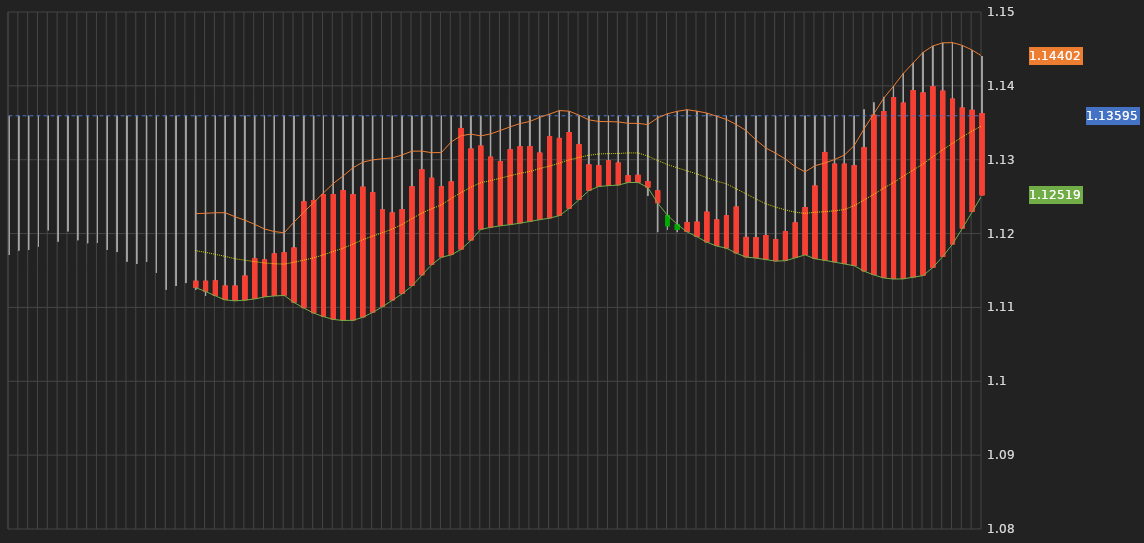
| Category | Series 0 | Series 1 | Series 2 | Series 3 |
|---|---|---|---|---|
| 23/05/2019 18:00:00 | 1.118 | 1.118 | 1.117 | 1.118 |
| 24/05/2019 00:00:00 | 1.118 | 1.118 | 1.118 | 1.118 |
| 24/05/2019 06:00:00 | 1.118 | 1.121 | 1.118 | 1.118 |
| 24/05/2019 12:00:00 | 1.118 | 1.121 | 1.118 | 1.121 |
| 24/05/2019 18:00:00 | 1.121 | 1.121 | 1.12 | 1.12 |
| 26/05/2019 18:00:00 | 1.119 | 1.121 | 1.119 | 1.121 |
| 27/05/2019 00:00:00 | 1.121 | 1.122 | 1.12 | 1.121 |
| 27/05/2019 06:00:00 | 1.121 | 1.121 | 1.119 | 1.12 |
| 27/05/2019 12:00:00 | 1.12 | 1.12 | 1.119 | 1.119 |
| 27/05/2019 18:00:00 | 1.119 | 1.119 | 1.119 | 1.119 |
| 28/05/2019 00:00:00 | 1.119 | 1.12 | 1.118 | 1.119 |
| 28/05/2019 06:00:00 | 1.119 | 1.12 | 1.118 | 1.119 |
| 28/05/2019 12:00:00 | 1.119 | 1.119 | 1.116 | 1.117 |
| 28/05/2019 18:00:00 | 1.117 | 1.117 | 1.116 | 1.117 |
| 29/05/2019 00:00:00 | 1.117 | 1.117 | 1.116 | 1.117 |
| 29/05/2019 06:00:00 | 1.117 | 1.117 | 1.115 | 1.115 |
| 29/05/2019 12:00:00 | 1.115 | 1.116 | 1.112 | 1.114 |
| 29/05/2019 18:00:00 | 1.114 | 1.114 | 1.113 | 1.114 |
| 30/05/2019 00:00:00 | 1.114 | 1.114 | 1.113 | 1.114 |
| 30/05/2019 06:00:00 | 1.114 | 1.114 | 1.112 | 1.114 |
| 30/05/2019 12:00:00 | 1.114 | 1.114 | 1.112 | 1.114 |
| 30/05/2019 18:00:00 | 1.114 | 1.114 | 1.113 | 1.113 |
| 31/05/2019 00:00:00 | 1.113 | 1.114 | 1.112 | 1.113 |
| 31/05/2019 06:00:00 | 1.113 | 1.116 | 1.113 | 1.114 |
| 31/05/2019 12:00:00 | 1.114 | 1.118 | 1.114 | 1.117 |
| 31/05/2019 18:00:00 | 1.117 | 1.118 | 1.116 | 1.117 |
| 06/02/2019 18:00 | 1.116 | 1.117 | 1.115 | 1.117 |
| 06/03/2019 00:00 | 1.117 | 1.119 | 1.117 | 1.117 |
| 06/03/2019 06:00 | 1.117 | 1.119 | 1.116 | 1.118 |
| 06/03/2019 12:00 | 1.118 | 1.125 | 1.118 | 1.124 |
| 06/03/2019 18:00 | 1.124 | 1.126 | 1.124 | 1.125 |
| 06/04/2019 00:00 | 1.125 | 1.126 | 1.124 | 1.125 |
| 06/04/2019 06:00 | 1.125 | 1.128 | 1.124 | 1.125 |
| 06/04/2019 12:00 | 1.125 | 1.127 | 1.123 | 1.126 |
| 06/04/2019 18:00 | 1.126 | 1.127 | 1.125 | 1.125 |
| 06/05/2019 00:00 | 1.125 | 1.127 | 1.125 | 1.126 |
| 06/05/2019 06:00 | 1.126 | 1.129 | 1.125 | 1.126 |
| 06/05/2019 12:00 | 1.126 | 1.131 | 1.123 | 1.123 |
| 06/05/2019 18:00 | 1.123 | 1.123 | 1.122 | 1.123 |
| 06/06/2019 00:00 | 1.123 | 1.123 | 1.122 | 1.123 |
| 06/06/2019 06:00 | 1.123 | 1.127 | 1.12 | 1.126 |
| 06/06/2019 12:00 | 1.126 | 1.131 | 1.124 | 1.129 |
| 06/06/2019 18:00 | 1.129 | 1.129 | 1.127 | 1.128 |
| 06/07/2019 00:00 | 1.128 | 1.128 | 1.126 | 1.126 |
| 06/07/2019 06:00 | 1.126 | 1.127 | 1.125 | 1.127 |
| 06/07/2019 12:00 | 1.127 | 1.135 | 1.126 | 1.134 |
| 06/07/2019 18:00 | 1.134 | 1.134 | 1.133 | 1.133 |
| 06/09/2019 18:00 | 1.132 | 1.133 | 1.131 | 1.132 |
| 06/10/2019 00:00 | 1.132 | 1.132 | 1.13 | 1.13 |
| 06/10/2019 06:00 | 1.13 | 1.131 | 1.129 | 1.13 |
| 06/10/2019 12:00 | 1.13 | 1.132 | 1.129 | 1.131 |
| 06/10/2019 18:00 | 1.131 | 1.132 | 1.131 | 1.132 |
| 06/11/2019 00:00 | 1.132 | 1.132 | 1.131 | 1.132 |
| 06/11/2019 06:00 | 1.132 | 1.133 | 1.13 | 1.131 |
| 06/11/2019 12:00 | 1.131 | 1.134 | 1.13 | 1.133 |
| 06/11/2019 18:00 | 1.133 | 1.134 | 1.132 | 1.133 |
| 06/12/2019 00:00 | 1.133 | 1.134 | 1.133 | 1.134 |
| 06/12/2019 06:00 | 1.134 | 1.134 | 1.131 | 1.132 |
| 06/12/2019 12:00 | 1.132 | 1.134 | 1.129 | 1.129 |
| 06/12/2019 18:00 | 1.129 | 1.13 | 1.128 | 1.129 |
| 13/06/2019 00:00:00 | 1.129 | 1.13 | 1.129 | 1.13 |
| 13/06/2019 06:00:00 | 1.13 | 1.13 | 1.128 | 1.13 |
| 13/06/2019 12:00:00 | 1.13 | 1.13 | 1.127 | 1.128 |
| 13/06/2019 18:00:00 | 1.128 | 1.128 | 1.127 | 1.128 |
| 14/06/2019 00:00:00 | 1.128 | 1.128 | 1.127 | 1.127 |
| 14/06/2019 06:00:00 | 1.127 | 1.129 | 1.125 | 1.126 |
| 14/06/2019 12:00:00 | 1.126 | 1.127 | 1.12 | 1.121 |
| 14/06/2019 18:00:00 | 1.121 | 1.121 | 1.12 | 1.121 |
| 16/06/2019 18:00:00 | 1.12 | 1.122 | 1.12 | 1.122 |
| 17/06/2019 00:00:00 | 1.122 | 1.122 | 1.121 | 1.122 |
| 17/06/2019 06:00:00 | 1.122 | 1.123 | 1.12 | 1.123 |
| 17/06/2019 12:00:00 | 1.123 | 1.125 | 1.122 | 1.122 |
| 17/06/2019 18:00:00 | 1.122 | 1.122 | 1.121 | 1.122 |
| 18/06/2019 00:00:00 | 1.122 | 1.124 | 1.122 | 1.124 |
| 18/06/2019 06:00:00 | 1.124 | 1.124 | 1.118 | 1.12 |
| 18/06/2019 12:00:00 | 1.12 | 1.121 | 1.118 | 1.119 |
| 18/06/2019 18:00:00 | 1.12 | 1.12 | 1.119 | 1.12 |
| 19/06/2019 00:00:00 | 1.12 | 1.12 | 1.119 | 1.119 |
| 19/06/2019 06:00:00 | 1.119 | 1.121 | 1.119 | 1.12 |
| 19/06/2019 12:00:00 | 1.12 | 1.122 | 1.12 | 1.122 |
| 19/06/2019 18:00:00 | 1.122 | 1.125 | 1.121 | 1.124 |
| 20/06/2019 00:00:00 | 1.124 | 1.127 | 1.124 | 1.127 |
| 20/06/2019 06:00:00 | 1.126 | 1.132 | 1.126 | 1.131 |
| 20/06/2019 12:00:00 | 1.131 | 1.132 | 1.127 | 1.13 |
| 20/06/2019 18:00:00 | 1.129 | 1.13 | 1.128 | 1.129 |
| 21/06/2019 00:00:00 | 1.129 | 1.131 | 1.129 | 1.129 |
| 21/06/2019 06:00:00 | 1.129 | 1.132 | 1.128 | 1.132 |
| 21/06/2019 12:00:00 | 1.132 | 1.137 | 1.131 | 1.136 |
| 21/06/2019 18:00:00 | 1.136 | 1.138 | 1.136 | 1.137 |
| 23/06/2019 18:00:00 | 1.137 | 1.138 | 1.136 | 1.138 |
| 24/06/2019 00:00:00 | 1.138 | 1.139 | 1.138 | 1.138 |
| 24/06/2019 06:00:00 | 1.138 | 1.14 | 1.137 | 1.139 |
| 24/06/2019 12:00:00 | 1.139 | 1.14 | 1.138 | 1.139 |
| 24/06/2019 18:00:00 | 1.139 | 1.14 | 1.139 | 1.14 |
| 25/06/2019 00:00:00 | 1.14 | 1.141 | 1.139 | 1.139 |
| 25/06/2019 06:00:00 | 1.139 | 1.14 | 1.138 | 1.138 |
| 25/06/2019 12:00:00 | 1.138 | 1.14 | 1.134 | 1.137 |
| 25/06/2019 18:00:00 | 1.137 | 1.138 | 1.136 | 1.137 |
| 26/06/2019 00:00:00 | 1.137 | 1.137 | 1.135 | 1.136 |
| 26/06/2019 06:00:00 | 1.136 | 1.137 | 1.135 | 1.136 |